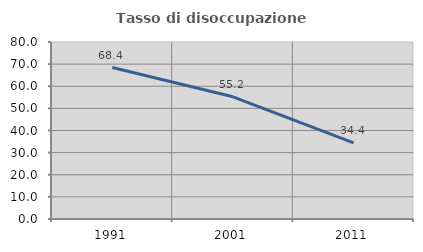
| Category | Tasso di disoccupazione giovanile  |
|---|---|
| 1991.0 | 68.448 |
| 2001.0 | 55.224 |
| 2011.0 | 34.395 |